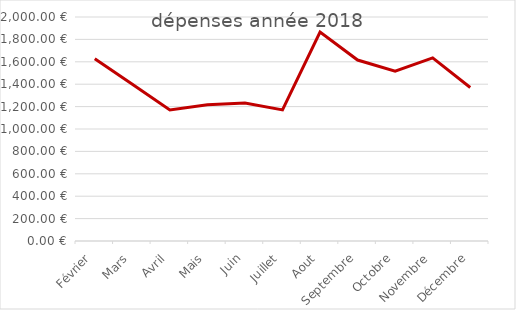
| Category | dépenses année 2017 |
|---|---|
| Février | 1626.69 |
| Mars | 1398.57 |
| Avril | 1170.57 |
| Mais | 1215.57 |
| Juin | 1231.82 |
| Juillet | 1170.57 |
| Aout | 1865.57 |
| Septembre | 1615.57 |
| Octobre | 1516.57 |
| Novembre | 1634.96 |
| Décembre | 1370.57 |